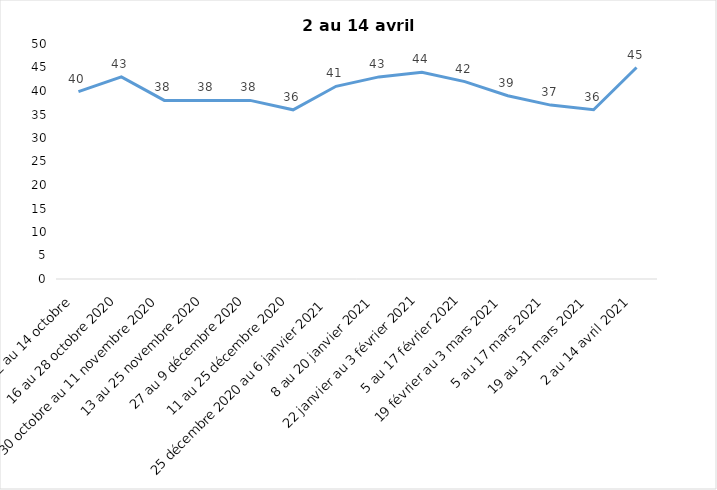
| Category | Toujours aux trois mesures |
|---|---|
| 2 au 14 octobre  | 39.85 |
| 16 au 28 octobre 2020 | 43 |
| 30 octobre au 11 novembre 2020 | 38 |
| 13 au 25 novembre 2020 | 38 |
| 27 au 9 décembre 2020 | 38 |
| 11 au 25 décembre 2020 | 36 |
| 25 décembre 2020 au 6 janvier 2021 | 41 |
| 8 au 20 janvier 2021 | 43 |
| 22 janvier au 3 février 2021 | 44 |
| 5 au 17 février 2021 | 42 |
| 19 février au 3 mars 2021 | 39 |
| 5 au 17 mars 2021 | 37 |
| 19 au 31 mars 2021 | 36 |
| 2 au 14 avril 2021 | 45 |